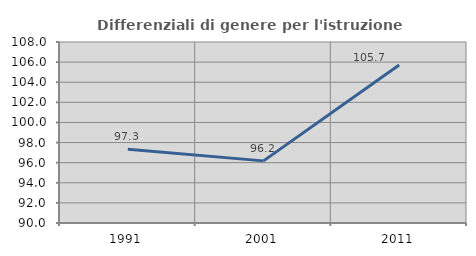
| Category | Differenziali di genere per l'istruzione superiore |
|---|---|
| 1991.0 | 97.336 |
| 2001.0 | 96.178 |
| 2011.0 | 105.716 |